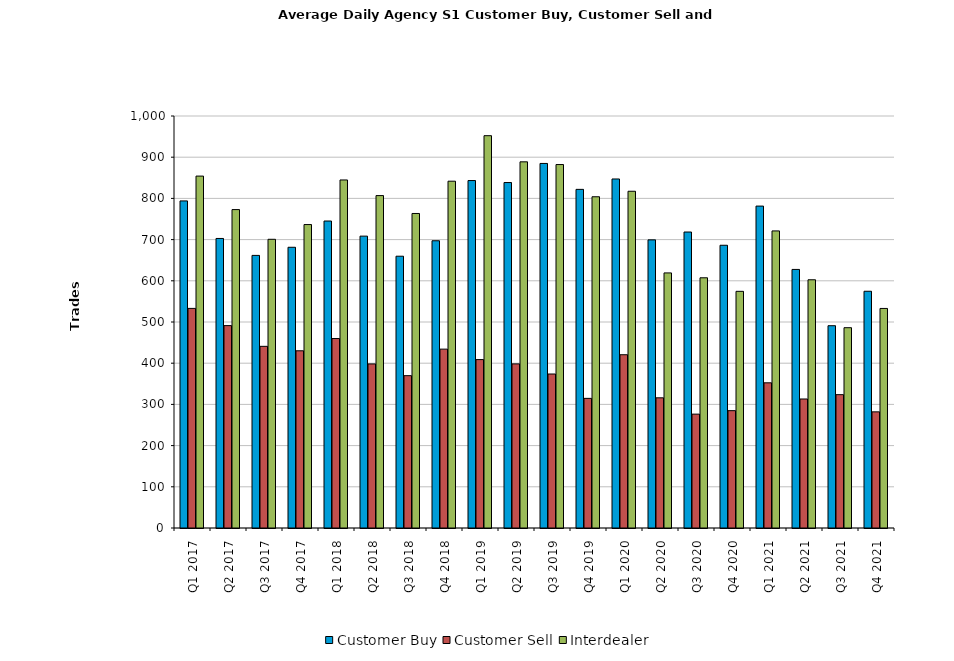
| Category | Customer Buy | Customer Sell | Interdealer |
|---|---|---|---|
| Q1 2017 | 793.887 | 533.016 | 854.177 |
| Q2 2017 | 702.762 | 491.206 | 772.857 |
| Q3 2017 | 661.651 | 440.937 | 700.746 |
| Q4 2017 | 681.365 | 430.111 | 736.524 |
| Q1 2018 | 745.098 | 459.869 | 844.754 |
| Q2 2018 | 708.406 | 398.219 | 806.812 |
| Q3 2018 | 659.667 | 369.762 | 763.397 |
| Q4 2018 | 697.19 | 434.127 | 841.746 |
| Q1 2019 | 843.295 | 408.787 | 952.246 |
| Q2 2019 | 838.492 | 398.349 | 888.746 |
| Q3 2019 | 884.844 | 373.766 | 882.172 |
| Q4 2019 | 821.906 | 314.656 | 804 |
| Q1 2020 | 847.161 | 420.581 | 817.339 |
| Q2 2020 | 699.365 | 315.984 | 619.127 |
| Q3 2020 | 718.391 | 276.359 | 607.312 |
| Q4 2020 | 686.266 | 284.797 | 574.438 |
| Q1 2021 | 781.328 | 352.377 | 721.082 |
| Q2 2021 | 627.587 | 313.111 | 602.508 |
| Q3 2021 | 491 | 323.672 | 486.188 |
| Q4 2021 | 574.609 | 281.906 | 532.891 |